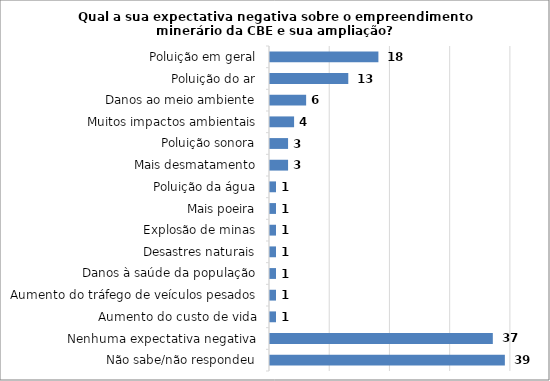
| Category | Series 0 |
|---|---|
| Não sabe/não respondeu | 39 |
| Nenhuma expectativa negativa | 37 |
| Aumento do custo de vida | 1 |
| Aumento do tráfego de veículos pesados | 1 |
| Danos à saúde da população | 1 |
| Desastres naturais | 1 |
| Explosão de minas | 1 |
| Mais poeira | 1 |
| Poluição da água | 1 |
| Mais desmatamento | 3 |
| Poluição sonora | 3 |
| Muitos impactos ambientais | 4 |
| Danos ao meio ambiente | 6 |
| Poluição do ar | 13 |
| Poluição em geral | 18 |